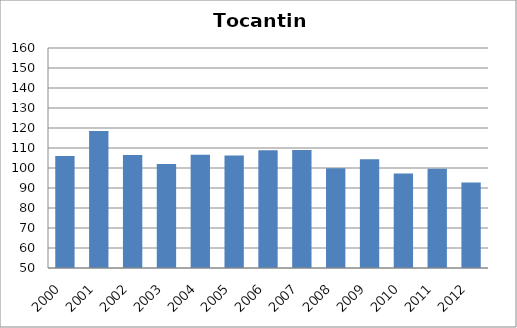
| Category | Poliomielite |
|---|---|
| 2000.0 | 106.04 |
| 2001.0 | 118.44 |
| 2002.0 | 106.54 |
| 2003.0 | 102.04 |
| 2004.0 | 106.65 |
| 2005.0 | 106.26 |
| 2006.0 | 108.91 |
| 2007.0 | 109.02 |
| 2008.0 | 99.83 |
| 2009.0 | 104.43 |
| 2010.0 | 97.21 |
| 2011.0 | 99.62 |
| 2012.0 | 92.75 |